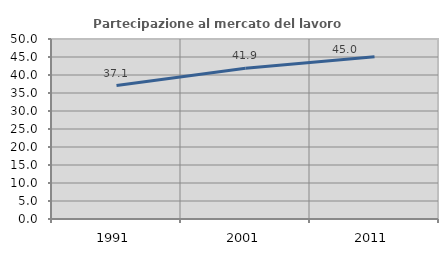
| Category | Partecipazione al mercato del lavoro  femminile |
|---|---|
| 1991.0 | 37.064 |
| 2001.0 | 41.872 |
| 2011.0 | 45.049 |